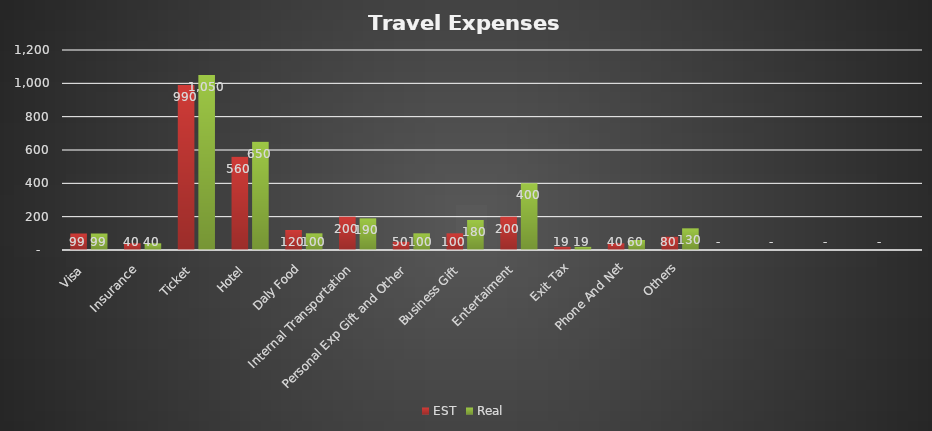
| Category | EST  | Real |
|---|---|---|
| Visa  | 99 | 99 |
| Insurance  | 40 | 40 |
| Ticket  | 990 | 1050 |
| Hotel  | 560 | 650 |
| Daly Food | 120 | 100 |
| Internal Transportation  | 200 | 190 |
| Personal Exp Gift and Other  | 50 | 100 |
| Business Gift  | 100 | 180 |
| Entertaiment  | 200 | 400 |
| Exit Tax | 19 | 19 |
| Phone And Net | 40 | 60 |
| Others | 80 | 130 |